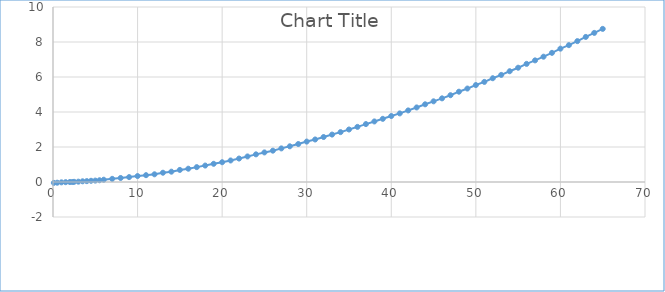
| Category | Series 0 |
|---|---|
| 0.1 | -0.05 |
| 0.5 | -0.04 |
| 1.0 | -0.02 |
| 1.5 | -0.01 |
| 2.0 | 0 |
| 2.3 | 0 |
| 2.5 | 0.01 |
| 3.0 | 0.02 |
| 3.5 | 0.04 |
| 4.0 | 0.05 |
| 4.5 | 0.07 |
| 5.0 | 0.08 |
| 5.5 | 0.1 |
| 6.0 | 0.13 |
| 7.0 | 0.18 |
| 8.0 | 0.23 |
| 9.0 | 0.28 |
| 10.0 | 0.34 |
| 11.0 | 0.39 |
| 12.0 | 0.44 |
| 13.0 | 0.53 |
| 14.0 | 0.59 |
| 15.0 | 0.69 |
| 16.0 | 0.76 |
| 17.0 | 0.85 |
| 18.0 | 0.94 |
| 19.0 | 1.04 |
| 20.0 | 1.13 |
| 21.0 | 1.23 |
| 22.0 | 1.34 |
| 23.0 | 1.46 |
| 24.0 | 1.58 |
| 25.0 | 1.69 |
| 26.0 | 1.79 |
| 27.0 | 1.92 |
| 28.0 | 2.04 |
| 29.0 | 2.17 |
| 30.0 | 2.31 |
| 31.0 | 2.43 |
| 32.0 | 2.57 |
| 33.0 | 2.71 |
| 34.0 | 2.85 |
| 35.0 | 3 |
| 36.0 | 3.15 |
| 37.0 | 3.31 |
| 38.0 | 3.46 |
| 39.0 | 3.61 |
| 40.0 | 3.77 |
| 41.0 | 3.92 |
| 42.0 | 4.09 |
| 43.0 | 4.26 |
| 44.0 | 4.44 |
| 45.0 | 4.61 |
| 46.0 | 4.78 |
| 47.0 | 4.96 |
| 48.0 | 5.16 |
| 49.0 | 5.34 |
| 50.0 | 5.54 |
| 51.0 | 5.72 |
| 52.0 | 5.93 |
| 53.0 | 6.12 |
| 54.0 | 6.33 |
| 55.0 | 6.53 |
| 56.0 | 6.75 |
| 57.0 | 6.95 |
| 58.0 | 7.16 |
| 59.0 | 7.38 |
| 60.0 | 7.62 |
| 61.0 | 7.82 |
| 62.0 | 8.05 |
| 63.0 | 8.29 |
| 64.0 | 8.52 |
| 65.0 | 8.75 |